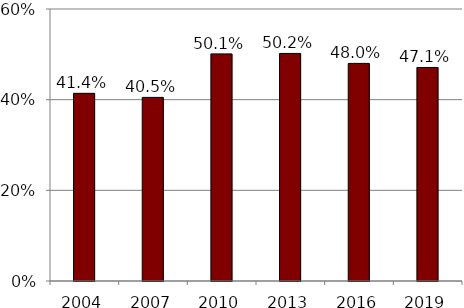
| Category | Series 1 |
|---|---|
| 2004.0 | 0.414 |
| 2007.0 | 0.405 |
| 2010.0 | 0.501 |
| 2013.0 | 0.502 |
| 2016.0 | 0.48 |
| 2019.0 | 0.471 |